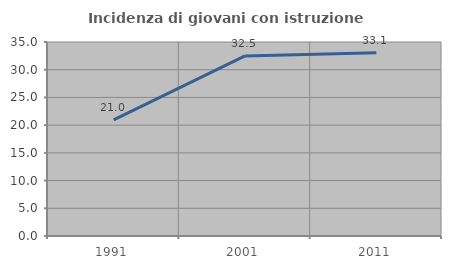
| Category | Incidenza di giovani con istruzione universitaria |
|---|---|
| 1991.0 | 20.958 |
| 2001.0 | 32.487 |
| 2011.0 | 33.071 |